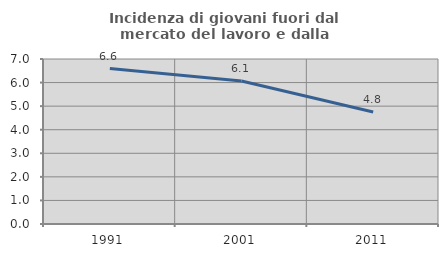
| Category | Incidenza di giovani fuori dal mercato del lavoro e dalla formazione  |
|---|---|
| 1991.0 | 6.593 |
| 2001.0 | 6.068 |
| 2011.0 | 4.753 |